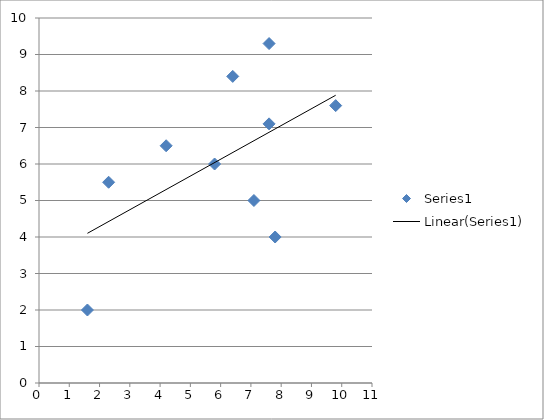
| Category | Series 0 |
|---|---|
| 1.6 | 2 |
| 2.3 | 5.5 |
| 4.2 | 6.5 |
| 5.8 | 6 |
| 6.4 | 8.4 |
| 7.1 | 5 |
| 7.6 | 7.1 |
| 7.6 | 9.3 |
| 7.8 | 4 |
| 9.8 | 7.6 |